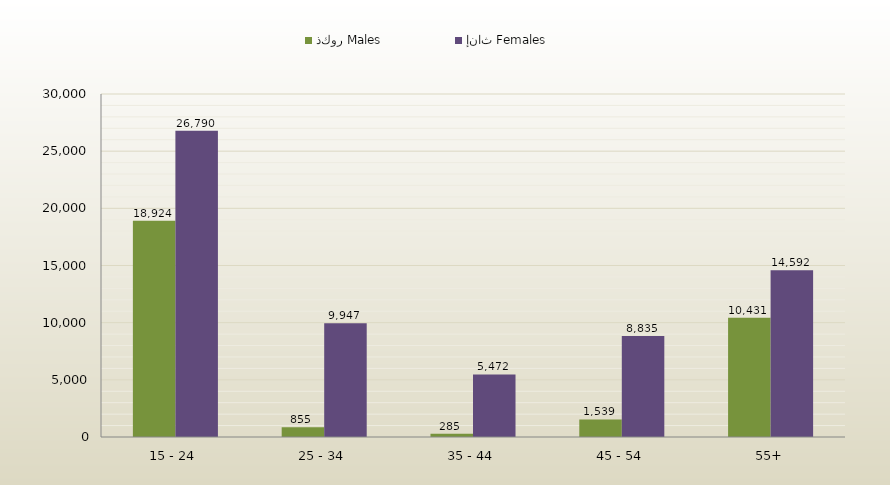
| Category | ذكور Males | إناث Females |
|---|---|---|
| 15 - 24 | 18924 | 26790 |
| 25 - 34 | 855 | 9947 |
| 35 - 44 | 285 | 5472 |
| 45 - 54 | 1539 | 8835 |
| 55+ | 10431 | 14592 |